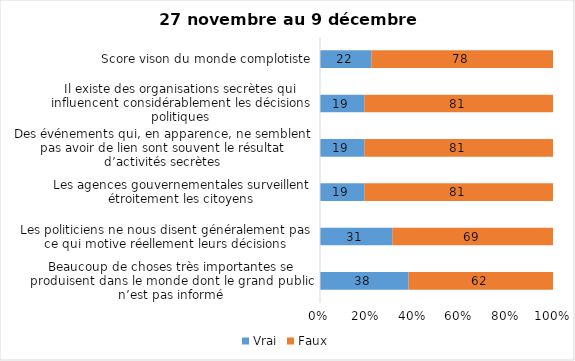
| Category | Vrai | Faux |
|---|---|---|
| Beaucoup de choses très importantes se produisent dans le monde dont le grand public n’est pas informé | 38 | 62 |
| Les politiciens ne nous disent généralement pas ce qui motive réellement leurs décisions | 31 | 69 |
| Les agences gouvernementales surveillent étroitement les citoyens | 19 | 81 |
| Des événements qui, en apparence, ne semblent pas avoir de lien sont souvent le résultat d’activités secrètes | 19 | 81 |
| Il existe des organisations secrètes qui influencent considérablement les décisions politiques | 19 | 81 |
| Score vison du monde complotiste | 22 | 78 |